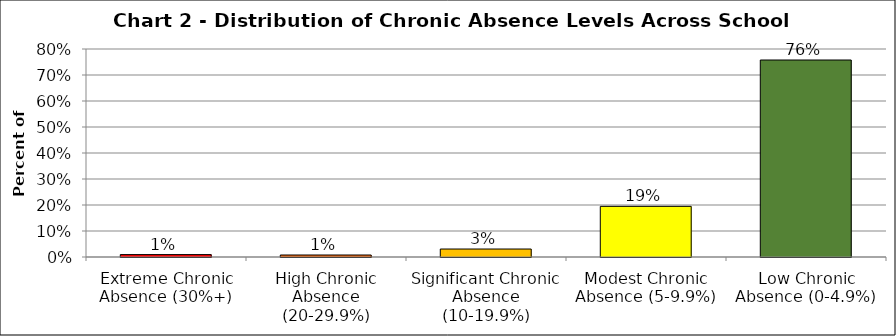
| Category | Series 1 |
|---|---|
| Extreme Chronic Absence (30%+) | 0.009 |
| High Chronic Absence (20-29.9%) | 0.008 |
| Significant Chronic Absence (10-19.9%) | 0.031 |
| Modest Chronic Absence (5-9.9%) | 0.195 |
| Low Chronic Absence (0-4.9%) | 0.758 |